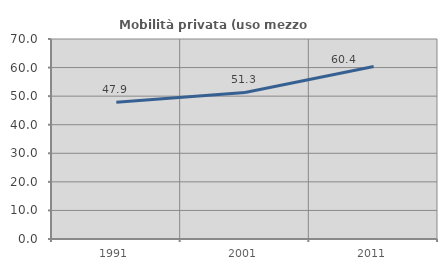
| Category | Mobilità privata (uso mezzo privato) |
|---|---|
| 1991.0 | 47.872 |
| 2001.0 | 51.282 |
| 2011.0 | 60.365 |